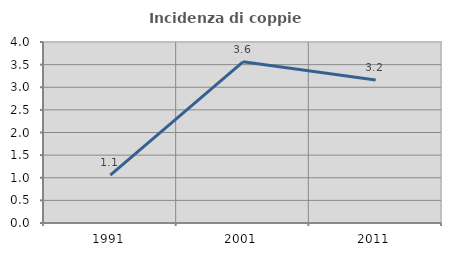
| Category | Incidenza di coppie miste |
|---|---|
| 1991.0 | 1.057 |
| 2001.0 | 3.562 |
| 2011.0 | 3.161 |